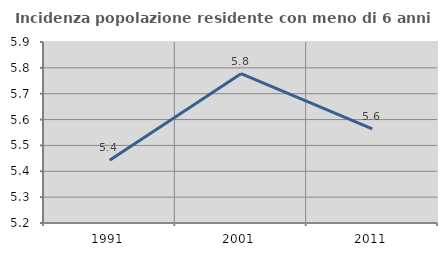
| Category | Incidenza popolazione residente con meno di 6 anni |
|---|---|
| 1991.0 | 5.442 |
| 2001.0 | 5.778 |
| 2011.0 | 5.564 |